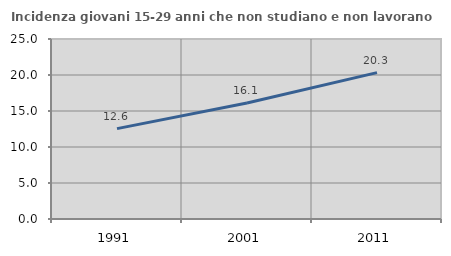
| Category | Incidenza giovani 15-29 anni che non studiano e non lavorano  |
|---|---|
| 1991.0 | 12.55 |
| 2001.0 | 16.107 |
| 2011.0 | 20.326 |